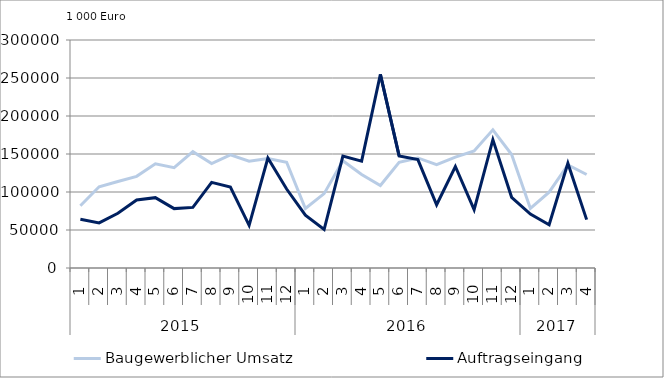
| Category | Baugewerblicher Umsatz | Auftragseingang |
|---|---|---|
| 0 | 81937.361 | 64244.383 |
| 1 | 106908.454 | 59377.677 |
| 2 | 113904.285 | 71953.971 |
| 3 | 120612.446 | 89496.024 |
| 4 | 137142.75 | 92563.213 |
| 5 | 132019.811 | 78131.737 |
| 6 | 153125.961 | 79765.729 |
| 7 | 137370.133 | 112637.987 |
| 8 | 148792.629 | 106572.56 |
| 9 | 140483.911 | 56073.767 |
| 10 | 144146.162 | 144643.688 |
| 11 | 139085.889 | 103931.175 |
| 12 | 78291.738 | 69470.357 |
| 13 | 97863.379 | 50640.033 |
| 14 | 141176.119 | 147206.65 |
| 15 | 123121.297 | 140579.009 |
| 16 | 108561.124 | 254739.334 |
| 17 | 139030.209 | 147481.644 |
| 18 | 144784.416 | 142609.658 |
| 19 | 135870.195 | 83192.156 |
| 20 | 145961.738 | 133594.351 |
| 21 | 153886.826 | 76793.838 |
| 22 | 181740.037 | 168867.568 |
| 23 | 149348.138 | 93011.853 |
| 24 | 78446.78 | 70908.903 |
| 25 | 99841.908 | 56868.408 |
| 26 | 135679.867 | 137790.423 |
| 27 | 123004.403 | 63637.761 |